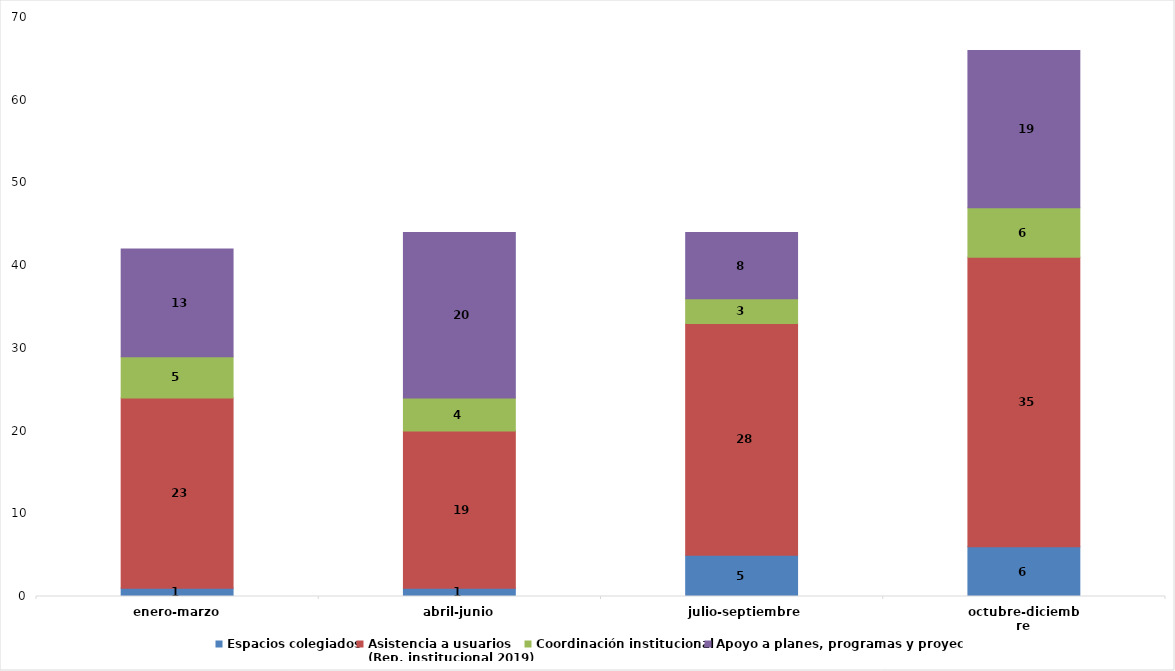
| Category | Espacios colegiados | Asistencia a usuarios 
(Rep. institucional 2019) | Coordinación institucional  | Apoyo a planes, programas y proyectos |
|---|---|---|---|---|
| enero-marzo | 1 | 23 | 5 | 13 |
| abril-junio | 1 | 19 | 4 | 20 |
| julio-septiembre | 5 | 28 | 3 | 8 |
| octubre-diciembre | 6 | 35 | 6 | 19 |